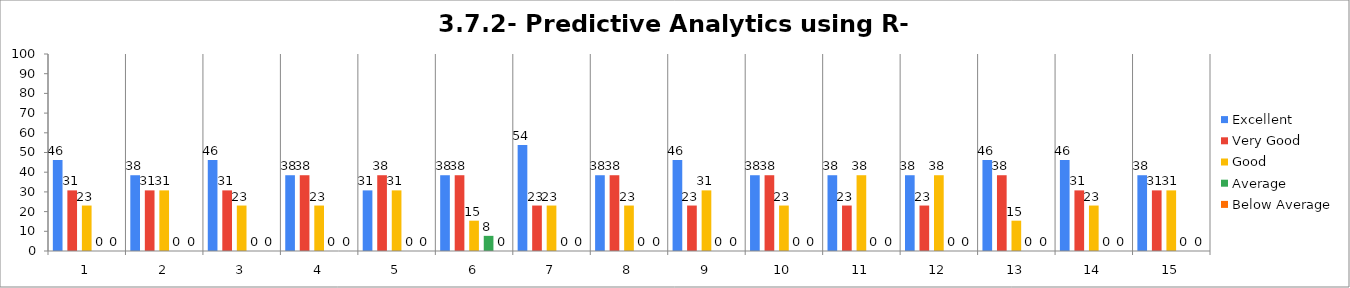
| Category | Excellent | Very Good | Good | Average | Below Average |
|---|---|---|---|---|---|
| 0 | 46.154 | 30.769 | 23.077 | 0 | 0 |
| 1 | 38.462 | 30.769 | 30.769 | 0 | 0 |
| 2 | 46.154 | 30.769 | 23.077 | 0 | 0 |
| 3 | 38.462 | 38.462 | 23.077 | 0 | 0 |
| 4 | 30.769 | 38.462 | 30.769 | 0 | 0 |
| 5 | 38.462 | 38.462 | 15.385 | 7.692 | 0 |
| 6 | 53.846 | 23.077 | 23.077 | 0 | 0 |
| 7 | 38.462 | 38.462 | 23.077 | 0 | 0 |
| 8 | 46.154 | 23.077 | 30.769 | 0 | 0 |
| 9 | 38.462 | 38.462 | 23.077 | 0 | 0 |
| 10 | 38.462 | 23.077 | 38.462 | 0 | 0 |
| 11 | 38.462 | 23.077 | 38.462 | 0 | 0 |
| 12 | 46.154 | 38.462 | 15.385 | 0 | 0 |
| 13 | 46.154 | 30.769 | 23.077 | 0 | 0 |
| 14 | 38.462 | 30.769 | 30.769 | 0 | 0 |